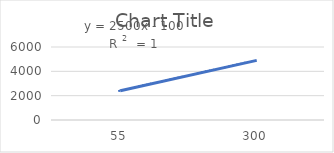
| Category | Series 0 |
|---|---|
| 55.0 | 2400 |
| 300.0 | 4900 |